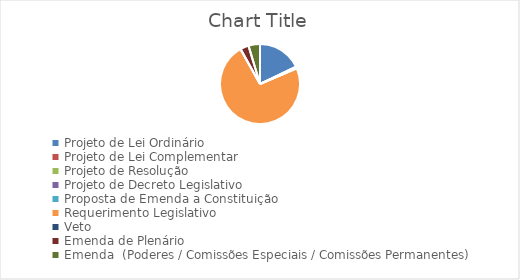
| Category | Series 0 | Series 1 |
|---|---|---|
| Projeto de Lei Ordinário | 411 |  |
| Projeto de Lei Complementar | 8 |  |
| Projeto de Resolução | 2 |  |
| Projeto de Decreto Legislativo | 5 |  |
| Proposta de Emenda a Constituição | 2 |  |
| Requerimento Legislativo | 1687 |  |
| Veto | 1 |  |
| Emenda de Plenário | 79 |  |
| Emenda  (Poderes / Comissões Especiais / Comissões Permanentes) | 107 |  |